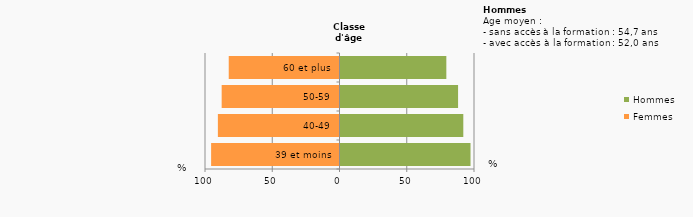
| Category | Femmes | Hommes |
|---|---|---|
| 39 et moins | -95.455 | 96.667 |
| 40-49 | -90.426 | 91.304 |
| 50-59 | -87.613 | 87.417 |
| 60 et plus | -82.353 | 78.689 |